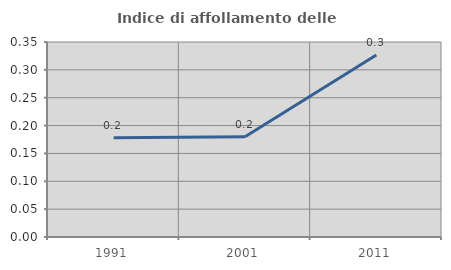
| Category | Indice di affollamento delle abitazioni  |
|---|---|
| 1991.0 | 0.178 |
| 2001.0 | 0.18 |
| 2011.0 | 0.327 |